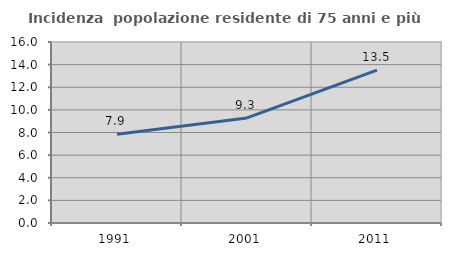
| Category | Incidenza  popolazione residente di 75 anni e più |
|---|---|
| 1991.0 | 7.853 |
| 2001.0 | 9.289 |
| 2011.0 | 13.522 |